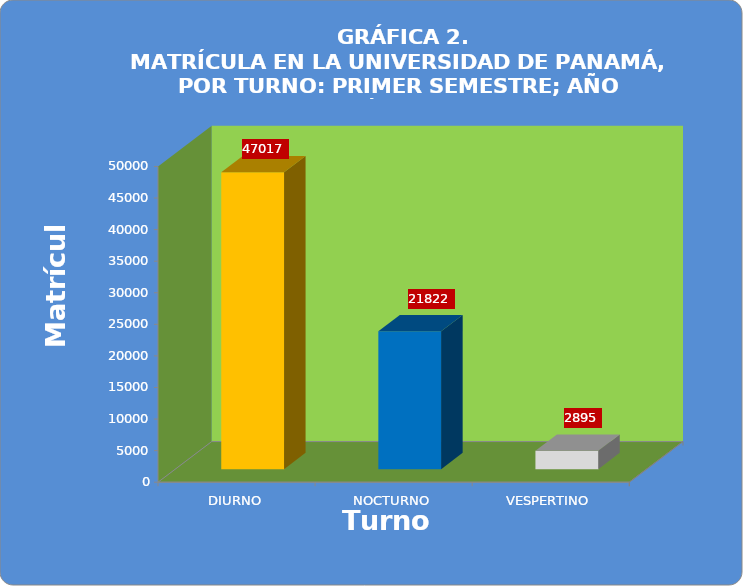
| Category | Series 0 |
|---|---|
| DIURNO | 47017 |
| NOCTURNO | 21822 |
| VESPERTINO | 2895 |